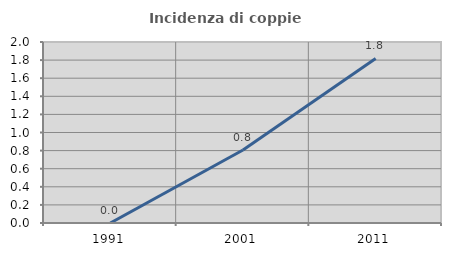
| Category | Incidenza di coppie miste |
|---|---|
| 1991.0 | 0 |
| 2001.0 | 0.806 |
| 2011.0 | 1.818 |